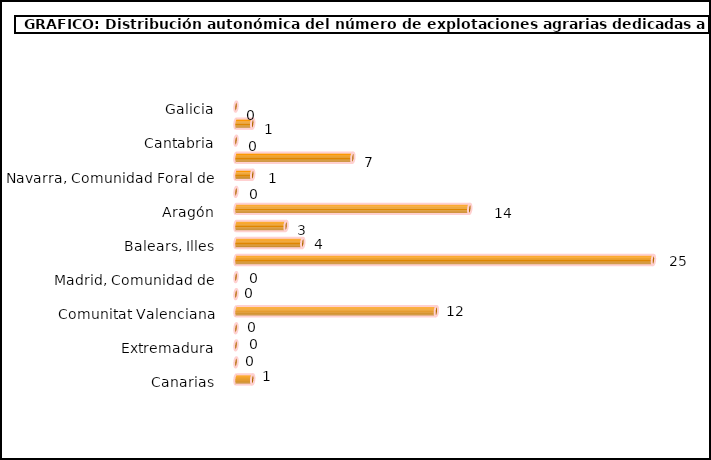
| Category | num. Explotaciones |
|---|---|
| Galicia | 0 |
| Asturias, Principado de | 1 |
| Cantabria | 0 |
| País Vasco | 7 |
| Navarra, Comunidad Foral de | 1 |
| Rioja, La | 0 |
| Aragón | 14 |
| Cataluña | 3 |
| Balears, Illes | 4 |
| Castilla y León | 25 |
| Madrid, Comunidad de | 0 |
| Castilla - La Mancha | 0 |
| Comunitat Valenciana | 12 |
| Murcia, Región de | 0 |
| Extremadura | 0 |
| Andalucía | 0 |
| Canarias | 1 |